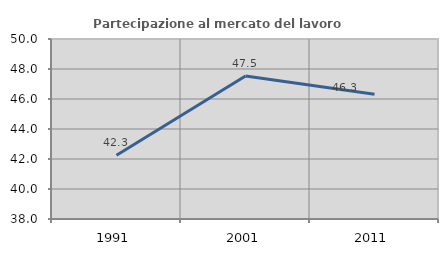
| Category | Partecipazione al mercato del lavoro  femminile |
|---|---|
| 1991.0 | 42.255 |
| 2001.0 | 47.537 |
| 2011.0 | 46.319 |